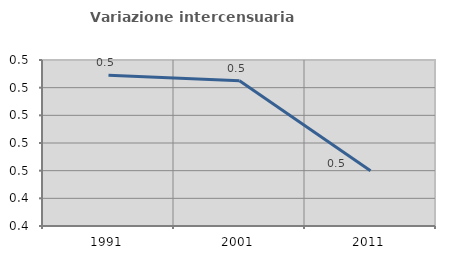
| Category | Variazione intercensuaria annua |
|---|---|
| 1991.0 | 0.529 |
| 2001.0 | 0.525 |
| 2011.0 | 0.46 |